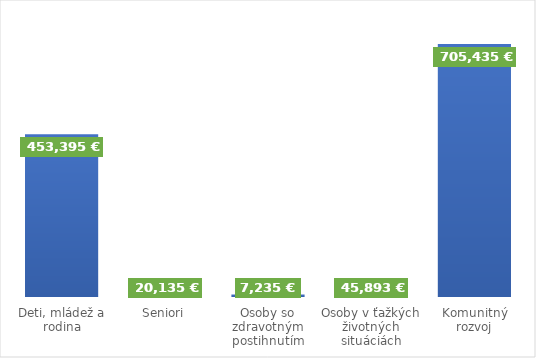
| Category | Zdroje z rozpočtu mesta na realizáciu aktivít KPSS |
|---|---|
| Deti, mládež a rodina | 453395 |
| Seniori | 20135 |
| Osoby so zdravotným postihnutím | 7235 |
| Osoby v ťažkých životných situáciách | 45893 |
| Komunitný rozvoj | 705435 |